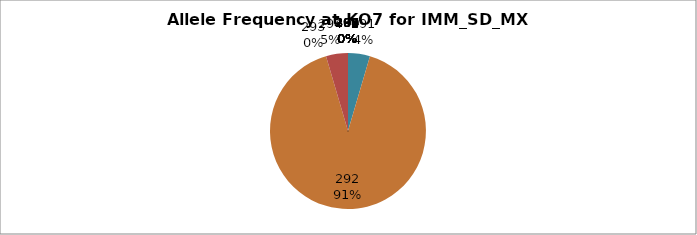
| Category | Series 0 |
|---|---|
| 260.0 | 0 |
| 285.0 | 0 |
| 289.0 | 0 |
| 290.0 | 0 |
| 291.0 | 0.045 |
| 292.0 | 0.909 |
| 293.0 | 0 |
| 294.0 | 0.045 |
| 295.0 | 0 |
| 296.0 | 0 |
| 297.0 | 0 |
| 298.0 | 0 |
| 299.0 | 0 |
| 300.0 | 0 |
| 301.0 | 0 |
| 302.0 | 0 |
| 304.0 | 0 |
| 305.0 | 0 |
| 306.0 | 0 |